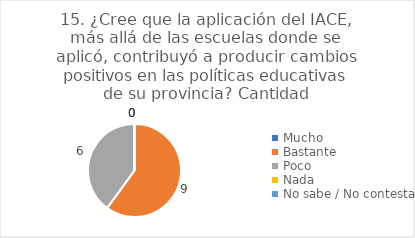
| Category | 15. ¿Cree que la aplicación del IACE, más allá de las escuelas donde se aplicó, contribuyó a producir cambios positivos en las políticas educativas de su provincia? |
|---|---|
| Mucho  | 0 |
| Bastante  | 0.6 |
| Poco  | 0.4 |
| Nada  | 0 |
| No sabe / No contesta | 0 |